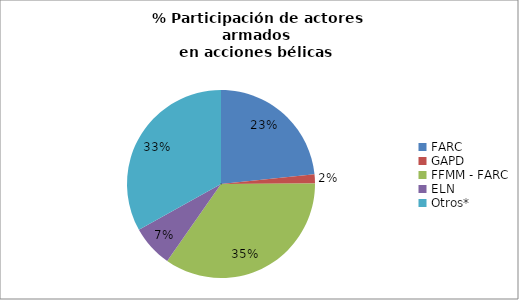
| Category | Series 0 |
|---|---|
| FARC | 360 |
| GAPD | 24 |
| FFMM - FARC | 536 |
| ELN | 111 |
| Otros* | 510 |